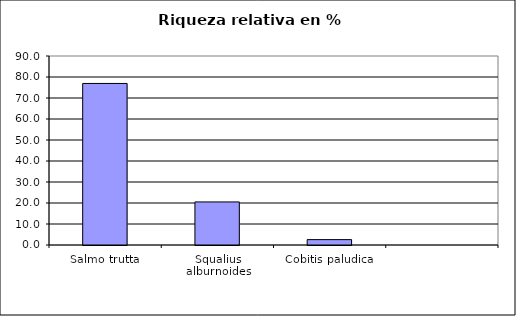
| Category | Series 0 |
|---|---|
| Salmo trutta | 76.923 |
| Squalius alburnoides | 20.513 |
| Cobitis paludica | 2.564 |